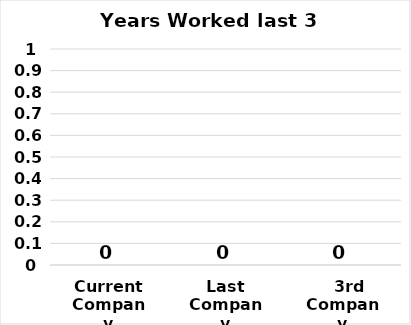
| Category | Series 0 |
|---|---|
| Current Company | 0 |
| Last Company | 0 |
|   3rd Company | 0 |